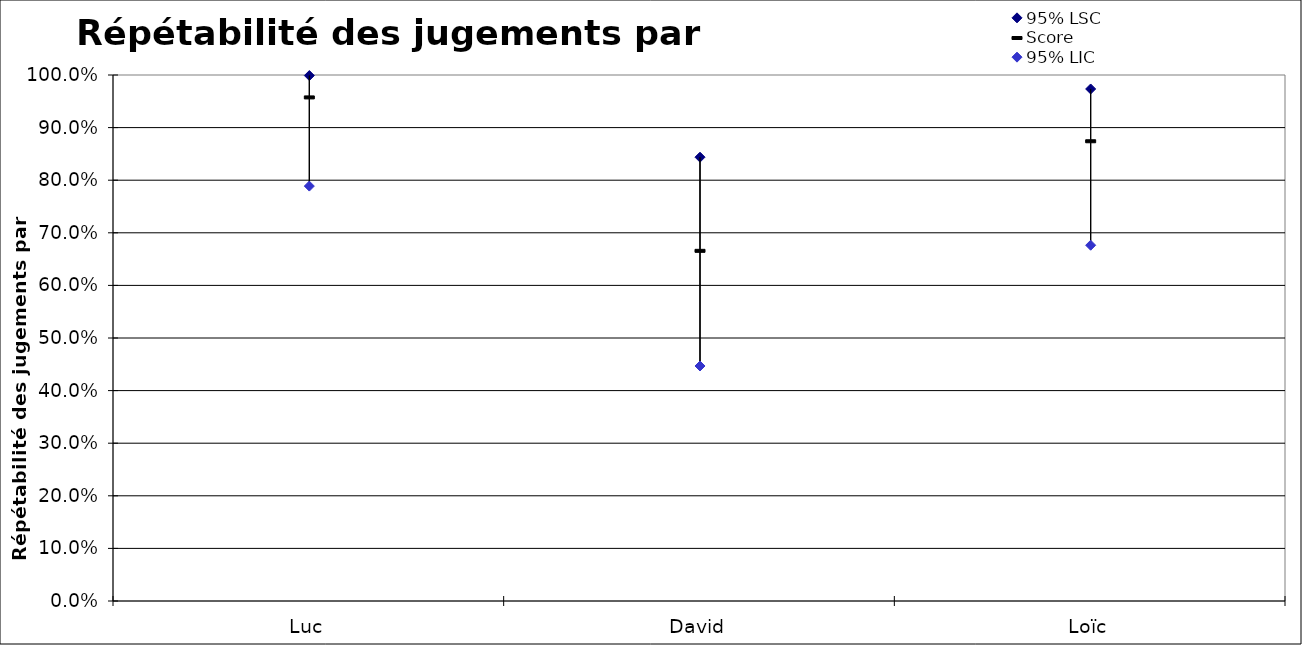
| Category | 95% LSC | Score | 95% LIC |
|---|---|---|---|
| Luc | 0.999 | 0.958 | 0.789 |
| David | 0.844 | 0.667 | 0.447 |
| Loïc | 0.973 | 0.875 | 0.676 |